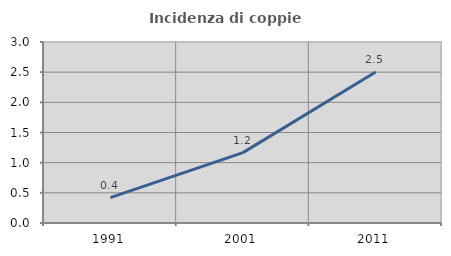
| Category | Incidenza di coppie miste |
|---|---|
| 1991.0 | 0.421 |
| 2001.0 | 1.166 |
| 2011.0 | 2.501 |